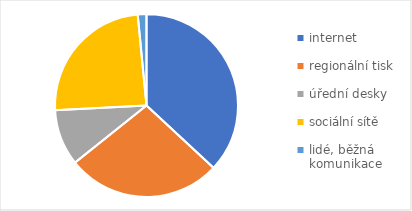
| Category | Series 0 |
|---|---|
| internet | 216 |
| regionální tisk | 160 |
| úřední desky | 58 |
| sociální sítě | 142 |
| lidé, běžná komunikace | 9 |